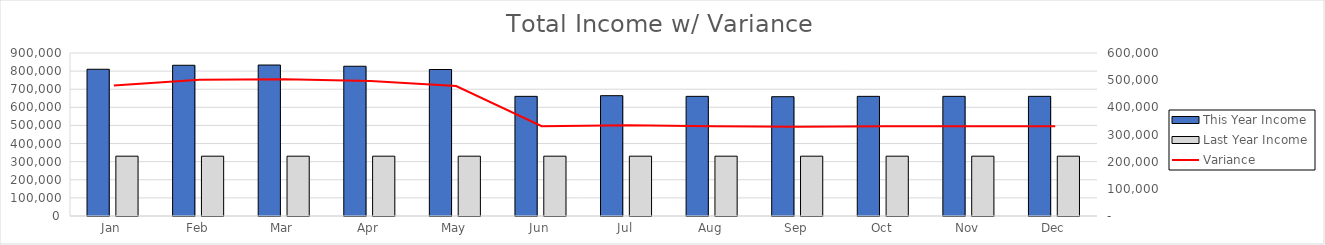
| Category | This Year Income | Last Year Income |
|---|---|---|
| Jan | 810262 | 330300 |
| Feb | 832227 | 330300 |
| Mar | 833602.19 | 330300 |
| Apr | 826830 | 330300 |
| May | 808872 | 330300 |
| Jun | 660600 | 330300 |
| Jul | 664310 | 330300 |
| Aug | 660600 | 330300 |
| Sep | 658771 | 330300 |
| Oct | 660600 | 330300 |
| Nov | 660600 | 330300 |
| Dec | 660600 | 330300 |